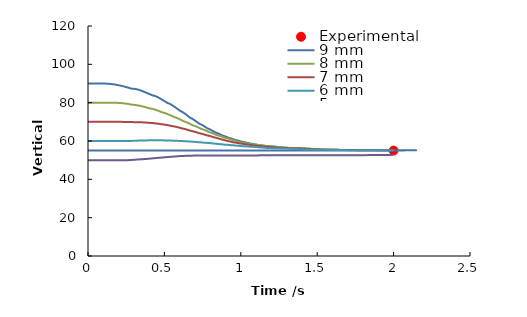
| Category | Experimental |
|---|---|
| 2.0 | 55 |